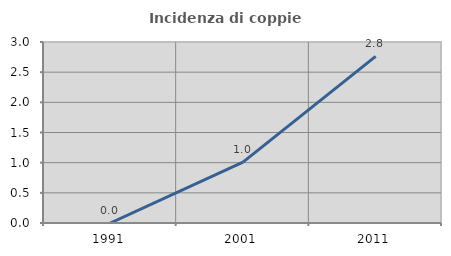
| Category | Incidenza di coppie miste |
|---|---|
| 1991.0 | 0 |
| 2001.0 | 1.01 |
| 2011.0 | 2.762 |